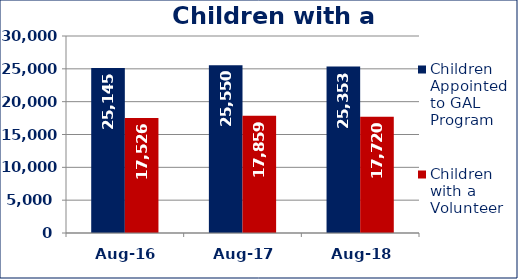
| Category | Children Appointed to GAL Program  | Children with a Volunteer  |
|---|---|---|
| Aug-16 | 25145 | 17526 |
| Aug-17 | 25550 | 17859 |
| Aug-18 | 25353 | 17720 |